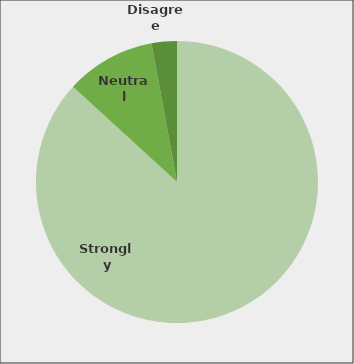
| Category | Series 0 |
|---|---|
| Strongly | 0.868 |
| Neutral | 0.103 |
| Disagree | 0.029 |